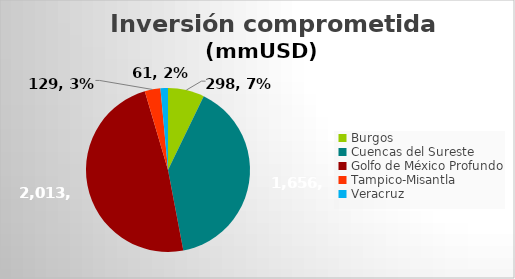
| Category | Commited investment (mmUSD) |
|---|---|
| Burgos | 298.443 |
| Cuencas del Sureste | 1656.019 |
| Golfo de México Profundo | 2013.114 |
| Tampico-Misantla | 128.827 |
| Veracruz | 61.303 |